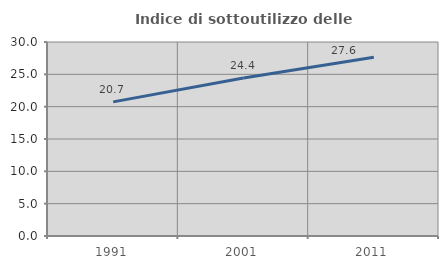
| Category | Indice di sottoutilizzo delle abitazioni  |
|---|---|
| 1991.0 | 20.738 |
| 2001.0 | 24.441 |
| 2011.0 | 27.626 |